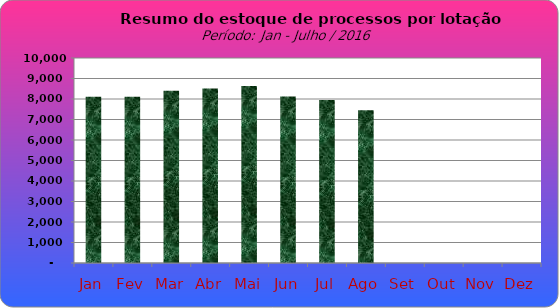
| Category | Series 0 |
|---|---|
| Jan | 8111 |
| Fev | 8114 |
| Mar | 8403 |
| Abr | 8512 |
| Mai | 8633 |
| Jun | 8120 |
| Jul | 7954 |
| Ago | 7447 |
| Set | 0 |
| Out | 0 |
| Nov | 0 |
| Dez | 0 |